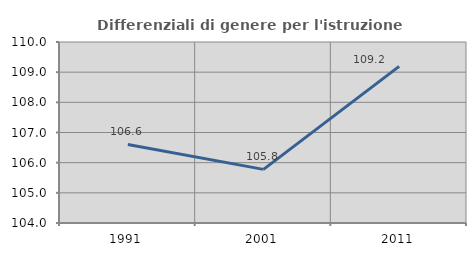
| Category | Differenziali di genere per l'istruzione superiore |
|---|---|
| 1991.0 | 106.602 |
| 2001.0 | 105.778 |
| 2011.0 | 109.191 |